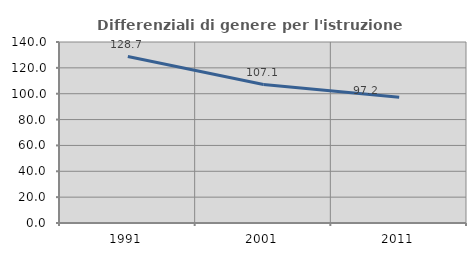
| Category | Differenziali di genere per l'istruzione superiore |
|---|---|
| 1991.0 | 128.747 |
| 2001.0 | 107.084 |
| 2011.0 | 97.181 |